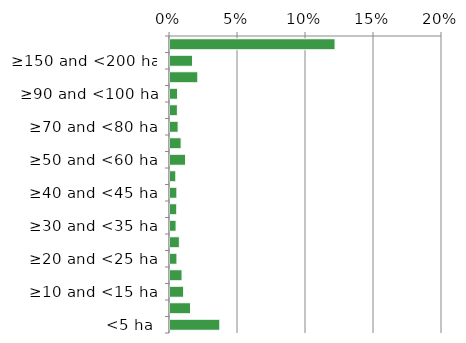
| Category | Non native |
|---|---|
| <5 ha | 0.037 |
| ≥5 and <10 ha | 0.015 |
| ≥10 and <15 ha | 0.01 |
| ≥15 and <20 ha | 0.009 |
| ≥20 and <25 ha | 0.005 |
| ≥25 and <30 ha | 0.007 |
| ≥30 and <35 ha | 0.004 |
| ≥35 and <40 ha | 0.005 |
| ≥40 and <45 ha | 0.005 |
| ≥45 and <50 ha | 0.004 |
| ≥50 and <60 ha | 0.011 |
| ≥60 and <70 ha | 0.008 |
| ≥70 and <80 ha | 0.006 |
| ≥80 and <90 ha | 0.005 |
| ≥90 and <100 ha | 0.006 |
| ≥100 and <150 ha | 0.02 |
| ≥150 and <200 ha | 0.017 |
| ≥200 ha | 0.121 |